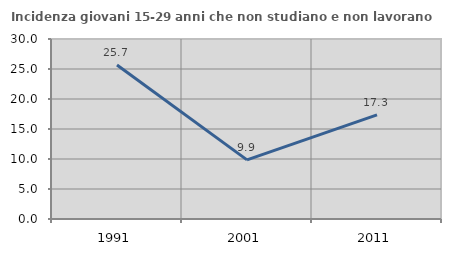
| Category | Incidenza giovani 15-29 anni che non studiano e non lavorano  |
|---|---|
| 1991.0 | 25.655 |
| 2001.0 | 9.852 |
| 2011.0 | 17.345 |